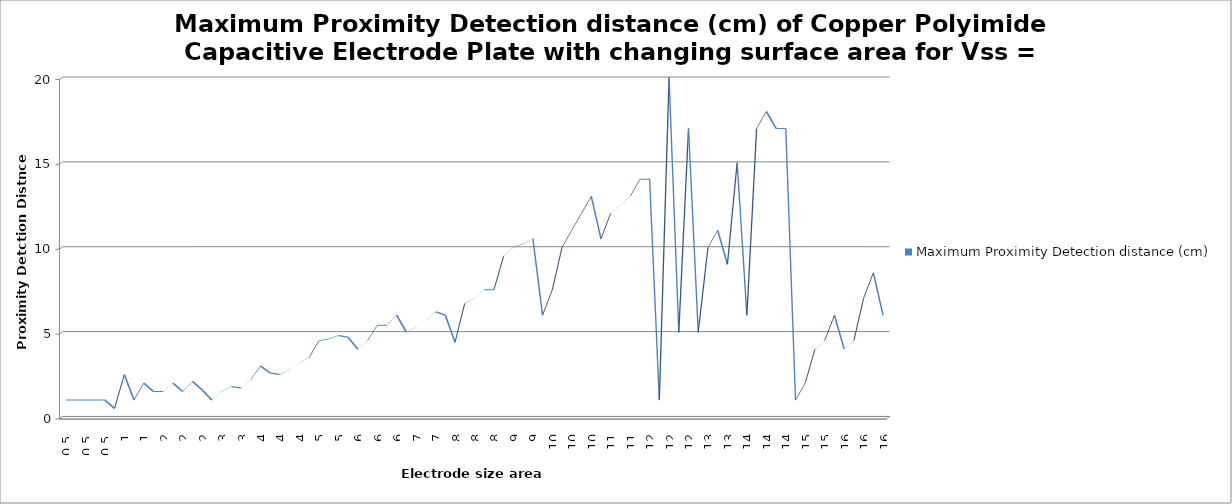
| Category | Maximum Proximity Detection distance (cm) |
|---|---|
| 0.5 | 1 |
| 0.5 | 1 |
| 0.5 | 1 |
| 0.5 | 1 |
| 0.5 | 1 |
| 1.0 | 0.5 |
| 1.0 | 2.5 |
| 1.0 | 1 |
| 1.0 | 2 |
| 1.0 | 1.5 |
| 2.0 | 1.5 |
| 2.0 | 2 |
| 2.0 | 1.5 |
| 2.0 | 2.1 |
| 2.0 | 1.6 |
| 3.0 | 1 |
| 3.0 | 1.5 |
| 3.0 | 1.8 |
| 3.0 | 1.7 |
| 3.0 | 2.2 |
| 4.0 | 3 |
| 4.0 | 2.6 |
| 4.0 | 2.5 |
| 4.0 | 2.8 |
| 4.0 | 3.2 |
| 5.0 | 3.5 |
| 5.0 | 4.5 |
| 5.0 | 4.6 |
| 5.0 | 4.8 |
| 5.0 | 4.7 |
| 6.0 | 4 |
| 6.0 | 4.5 |
| 6.0 | 5.4 |
| 6.0 | 5.4 |
| 6.0 | 6 |
| 7.0 | 5 |
| 7.0 | 5.3 |
| 7.0 | 5.7 |
| 7.0 | 6.2 |
| 7.0 | 6 |
| 8.0 | 4.4 |
| 8.0 | 6.7 |
| 8.0 | 7 |
| 8.0 | 7.5 |
| 8.0 | 7.5 |
| 9.0 | 9.5 |
| 9.0 | 10 |
| 9.0 | 10.2 |
| 9.0 | 10.5 |
| 9.0 | 6 |
| 10.0 | 7.5 |
| 10.0 | 10 |
| 10.0 | 11 |
| 10.0 | 12 |
| 10.0 | 13 |
| 11.0 | 10.5 |
| 11.0 | 12 |
| 11.0 | 12.5 |
| 11.0 | 13 |
| 11.0 | 14 |
| 12.0 | 14 |
| 12.0 | 1 |
| 12.0 | 20 |
| 12.0 | 5 |
| 12.0 | 17 |
| 13.0 | 5 |
| 13.0 | 10 |
| 13.0 | 11 |
| 13.0 | 9 |
| 13.0 | 15 |
| 14.0 | 6 |
| 14.0 | 17 |
| 14.0 | 18 |
| 14.0 | 17 |
| 14.0 | 17 |
| 15.0 | 1 |
| 15.0 | 2 |
| 15.0 | 4 |
| 15.0 | 4.5 |
| 15.0 | 6 |
| 16.0 | 4 |
| 16.0 | 4.5 |
| 16.0 | 7 |
| 16.0 | 8.5 |
| 16.0 | 6 |